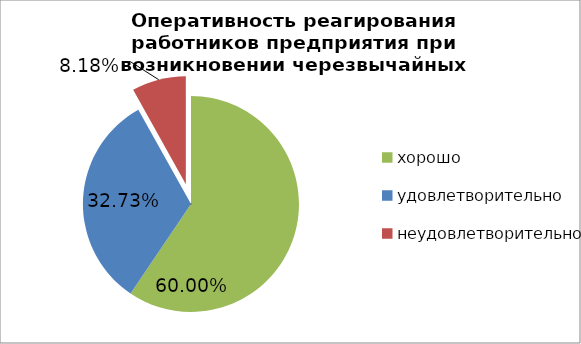
| Category | Series 1 |
|---|---|
| хорошо | 0.6 |
| удовлетворительно | 0.327 |
| неудовлетворительно | 0.082 |